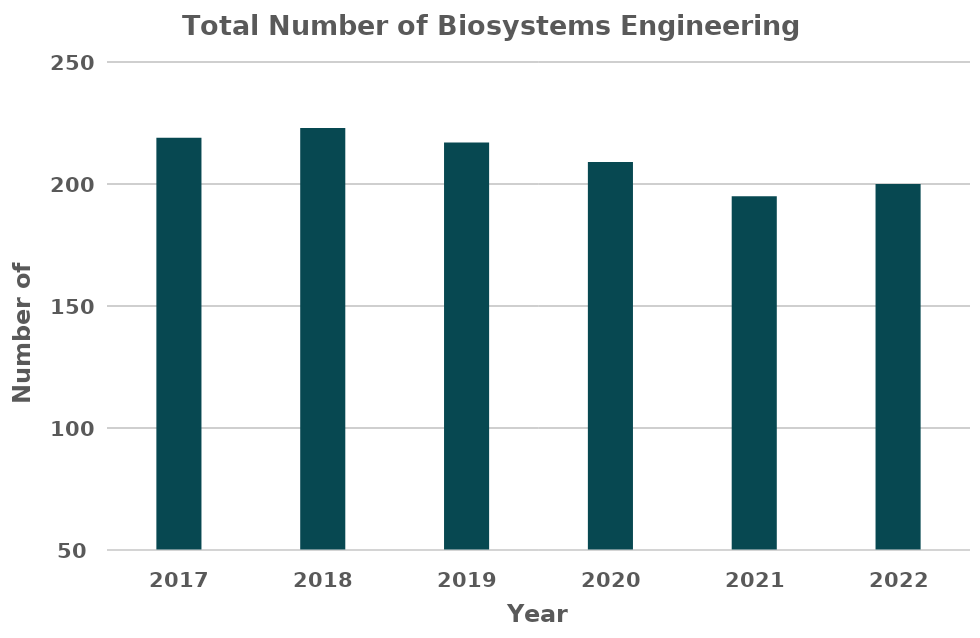
| Category | Total Number of Biosystems Engineering Students |
|---|---|
| 2017.0 | 219 |
| 2018.0 | 223 |
| 2019.0 | 217 |
| 2020.0 | 209 |
| 2021.0 | 195 |
| 2022.0 | 200 |